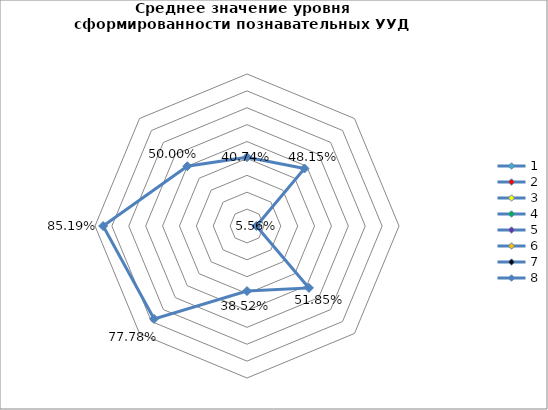
| Category | Series 0 |
|---|---|
| 0 | 0.407 |
| 1 | 0.481 |
| 2 | 0.056 |
| 3 | 0.519 |
| 4 | 0.385 |
| 5 | 0.778 |
| 6 | 0.852 |
| 7 | 0.5 |